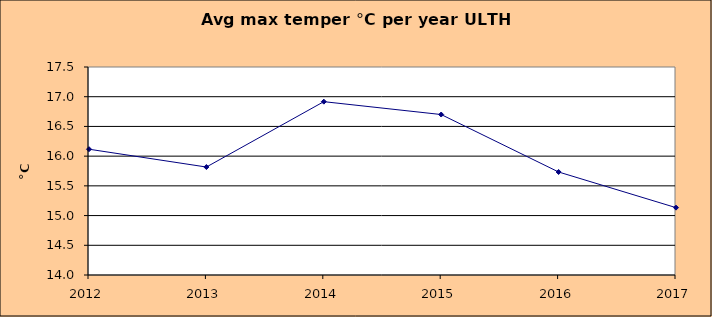
| Category | Series 0 |
|---|---|
| 2012.0 | 16.117 |
| 2013.0 | 15.817 |
| 2014.0 | 16.917 |
| 2015.0 | 16.7 |
| 2016.0 | 15.733 |
| 2017.0 | 15.133 |